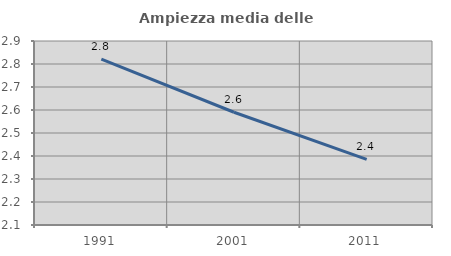
| Category | Ampiezza media delle famiglie |
|---|---|
| 1991.0 | 2.821 |
| 2001.0 | 2.59 |
| 2011.0 | 2.385 |